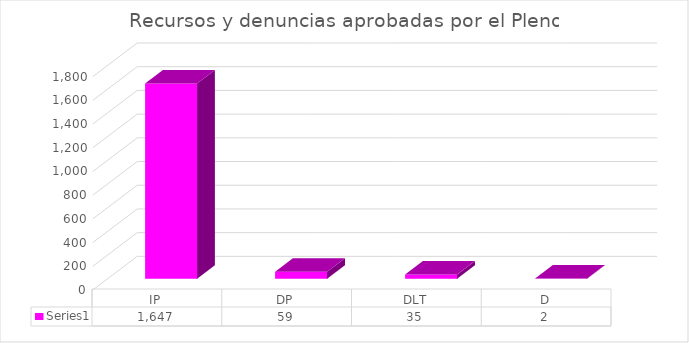
| Category | Series 0 |
|---|---|
| IP | 1647 |
| DP | 59 |
| DLT | 35 |
| D | 2 |